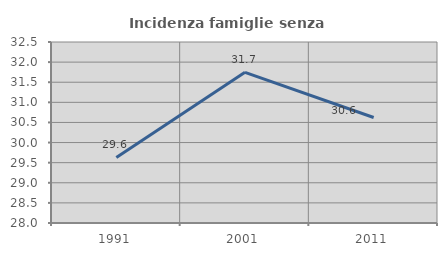
| Category | Incidenza famiglie senza nuclei |
|---|---|
| 1991.0 | 29.63 |
| 2001.0 | 31.746 |
| 2011.0 | 30.622 |